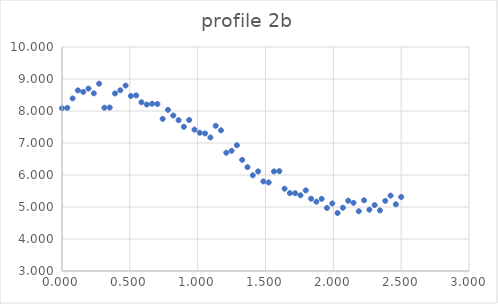
| Category | Series 0 |
|---|---|
| 0.0 | 8.085 |
| 0.0390625 | 8.1 |
| 0.078125 | 8.393 |
| 0.1171875 | 8.644 |
| 0.15625 | 8.597 |
| 0.1953125 | 8.701 |
| 0.234375 | 8.553 |
| 0.2734375 | 8.854 |
| 0.3125 | 8.103 |
| 0.3515625 | 8.109 |
| 0.390625 | 8.549 |
| 0.4296875 | 8.647 |
| 0.46875 | 8.795 |
| 0.5078125 | 8.469 |
| 0.546875 | 8.488 |
| 0.5859375 | 8.272 |
| 0.625 | 8.201 |
| 0.6640625 | 8.226 |
| 0.703125 | 8.22 |
| 0.7421875 | 7.755 |
| 0.78125 | 8.036 |
| 0.8203125 | 7.859 |
| 0.859375 | 7.714 |
| 0.8984375 | 7.505 |
| 0.9375 | 7.719 |
| 0.9765625 | 7.419 |
| 1.015625 | 7.319 |
| 1.0546875 | 7.3 |
| 1.09375 | 7.173 |
| 1.1328125 | 7.537 |
| 1.171875 | 7.396 |
| 1.2109375 | 6.695 |
| 1.25 | 6.757 |
| 1.2890625 | 6.93 |
| 1.328125 | 6.472 |
| 1.3671875 | 6.245 |
| 1.40625 | 5.991 |
| 1.4453125 | 6.112 |
| 1.484375 | 5.799 |
| 1.5234375 | 5.767 |
| 1.5625 | 6.112 |
| 1.6015625 | 6.12 |
| 1.640625 | 5.571 |
| 1.6796875 | 5.434 |
| 1.71875 | 5.432 |
| 1.7578125 | 5.366 |
| 1.796875 | 5.519 |
| 1.8359375 | 5.259 |
| 1.875 | 5.166 |
| 1.9140625 | 5.255 |
| 1.953125 | 4.969 |
| 1.9921875 | 5.111 |
| 2.03125 | 4.812 |
| 2.0703125 | 4.977 |
| 2.109375 | 5.196 |
| 2.1484375 | 5.131 |
| 2.1875 | 4.868 |
| 2.2265625 | 5.211 |
| 2.265625 | 4.916 |
| 2.3046875 | 5.06 |
| 2.34375 | 4.894 |
| 2.3828125 | 5.192 |
| 2.421875 | 5.356 |
| 2.4609375 | 5.084 |
| 2.5 | 5.313 |